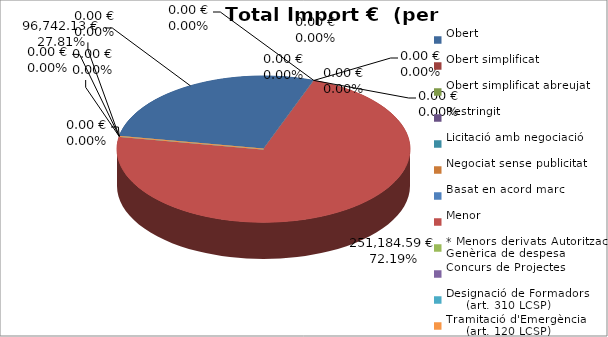
| Category | Total preu
(amb IVA) |
|---|---|
| Obert | 96742.13 |
| Obert simplificat | 0 |
| Obert simplificat abreujat | 0 |
| Restringit | 0 |
| Licitació amb negociació | 0 |
| Negociat sense publicitat | 0 |
| Basat en acord marc | 0 |
| Menor | 251184.59 |
| * Menors derivats Autorització Genèrica de despesa | 0 |
| Concurs de Projectes | 0 |
| Designació de Formadors
     (art. 310 LCSP) | 0 |
| Tramitació d'Emergència
     (art. 120 LCSP) | 0 |